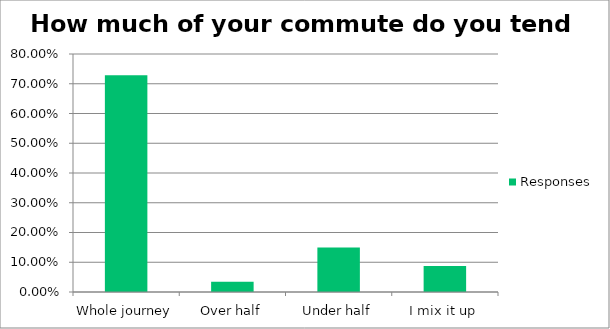
| Category | Responses |
|---|---|
| Whole journey | 0.728 |
| Over half | 0.035 |
| Under half | 0.15 |
| I mix it up | 0.087 |